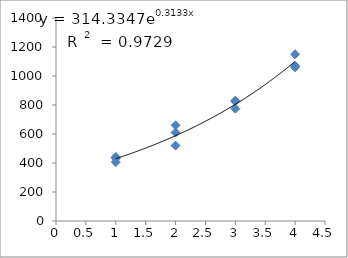
| Category | Series 0 |
|---|---|
| 1.0 | 406 |
| 1.0 | 442 |
| 1.0 | 432 |
| 2.0 | 520 |
| 2.0 | 610 |
| 2.0 | 660 |
| 3.0 | 830 |
| 3.0 | 775 |
| 3.0 | 825 |
| 4.0 | 1150 |
| 4.0 | 1060 |
| 4.0 | 1070 |